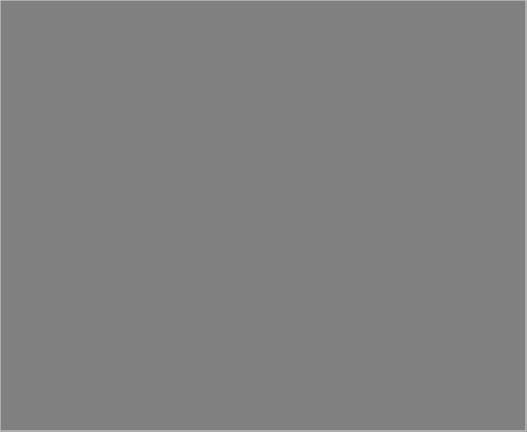
| Category | Series 0 |
|---|---|
| Live | 0 |
| Give | 0 |
| Owe:Debt | 0 |
| Owe:Taxes | 0 |
| Grow | 0 |